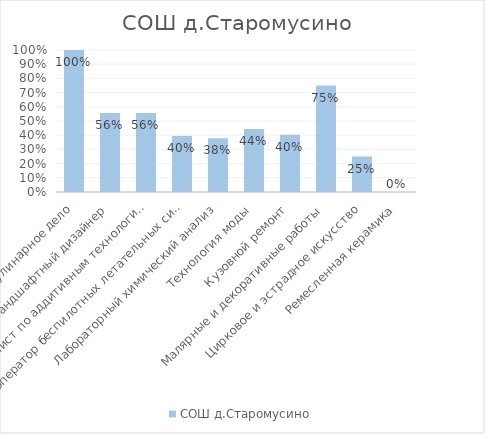
| Category | СОШ д.Старомусино |
|---|---|
| Кулинарное дело | 1 |
| Ландшафтный дизайнер | 0.556 |
| Специалист по аддитивным технологиям | 0.556 |
| Оператор беспилотных летательных систем | 0.395 |
| Лабораторный химический анализ | 0.379 |
| Технология моды | 0.444 |
| Кузовной ремонт | 0.403 |
| Малярные и декоративные работы | 0.75 |
| Цирковое и эстрадное искусство | 0.25 |
| Ремесленная керамика | 0 |